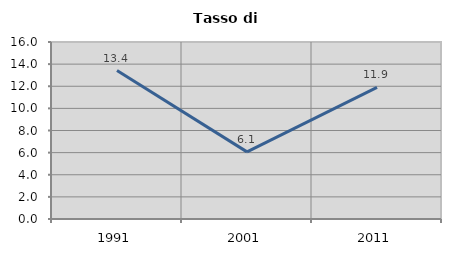
| Category | Tasso di disoccupazione   |
|---|---|
| 1991.0 | 13.419 |
| 2001.0 | 6.07 |
| 2011.0 | 11.9 |